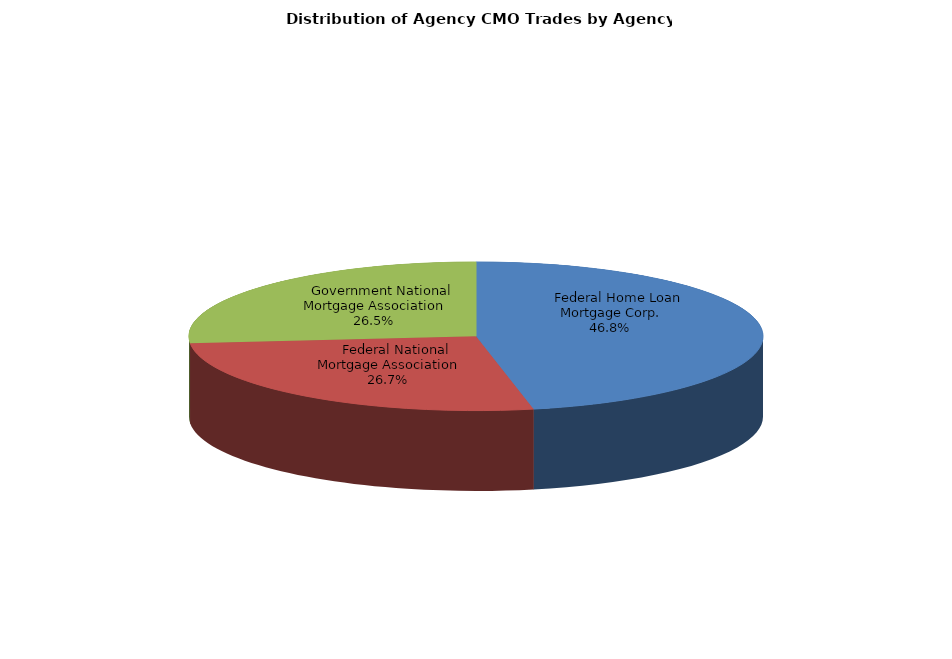
| Category | Series 0 |
|---|---|
|     Federal Home Loan Mortgage Corp. | 734.456 |
|     Federal National Mortgage Association | 419.647 |
|     Government National Mortgage Association | 415.54 |